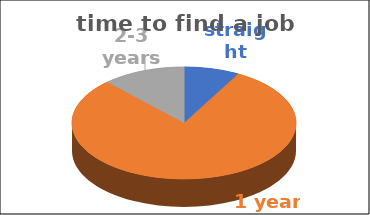
| Category | time to find a job | Series 1 | Series 2 | Series 3 | Series 4 |
|---|---|---|---|---|---|
| straight away | 0.08 |  |  |  |  |
| 1 year | 0.8 |  |  |  |  |
| 2-3 years | 0.12 |  |  |  |  |